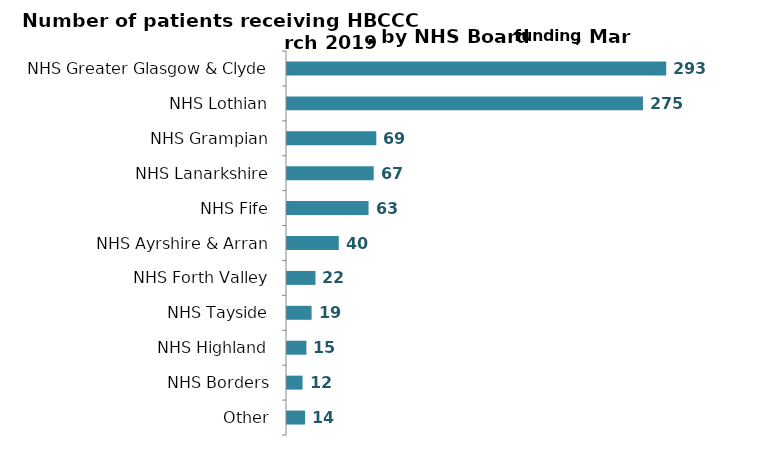
| Category | Series 0 |
|---|---|
| NHS Greater Glasgow & Clyde | 293 |
| NHS Lothian | 275 |
| NHS Grampian | 69 |
| NHS Lanarkshire | 67 |
| NHS Fife | 63 |
| NHS Ayrshire & Arran | 40 |
| NHS Forth Valley | 22 |
| NHS Tayside | 19 |
| NHS Highland | 15 |
| NHS Borders | 12 |
| Other | 14 |